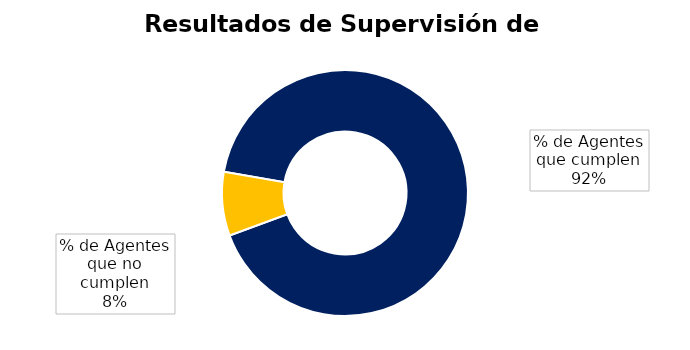
| Category | Cuenta de Departamento |
|---|---|
| % de Agentes que cumplen | 120 |
| % de Agentes que no cumplen | 11 |